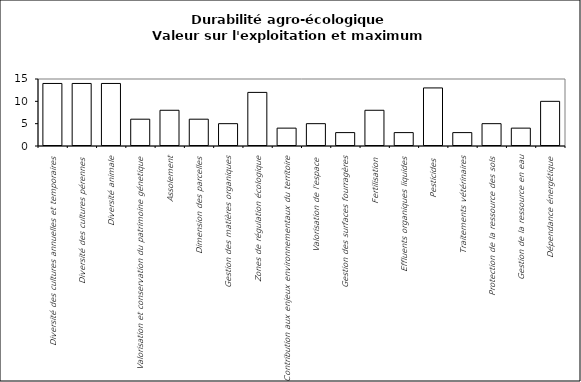
| Category | Valeur de l'exploitation agricole | Complément au maximum |
|---|---|---|
| Diversité des cultures annuelles et temporaires | 0 | 14 |
| Diversité des cultures pérennes | 0 | 14 |
| Diversité animale | 0 | 14 |
| Valorisation et conservation du patrimoine génetique | 0 | 6 |
| Assolement | 0 | 8 |
| Dimension des parcelles | 0 | 6 |
| Gestion des matières organiques | 0 | 5 |
| Zones de régulation écologique | 0 | 12 |
| Contribution aux enjeux environnementaux du territoire | 0 | 4 |
| Valorisation de l'espace | 0 | 5 |
| Gestion des surfaces fourragères | 0 | 3 |
| Fertilisation | 0 | 8 |
| Effluents organiques liquides | 0 | 3 |
| Pesticides  | 0 | 13 |
| Traitements vétérinaires | 0 | 3 |
| Protection de la ressource des sols | 0 | 5 |
| Gestion de la ressource en eau | 0 | 4 |
| Dépendance énergétique | 0 | 10 |